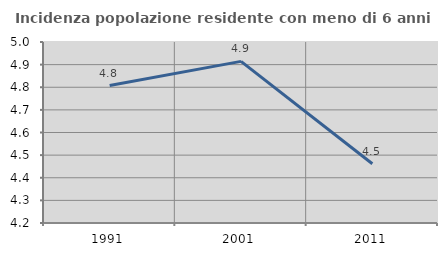
| Category | Incidenza popolazione residente con meno di 6 anni |
|---|---|
| 1991.0 | 4.808 |
| 2001.0 | 4.914 |
| 2011.0 | 4.462 |